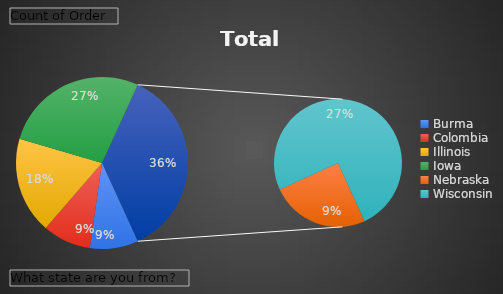
| Category | Total |
|---|---|
| Burma | 1 |
| Colombia  | 1 |
| Illinois | 2 |
| Iowa | 3 |
| Nebraska | 1 |
| Wisconsin | 3 |